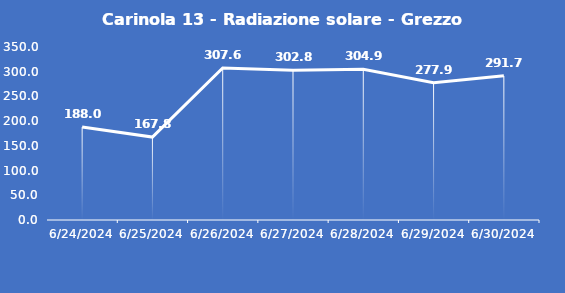
| Category | Carinola 13 - Radiazione solare - Grezzo (W/m2) |
|---|---|
| 6/24/24 | 188 |
| 6/25/24 | 167.8 |
| 6/26/24 | 307.6 |
| 6/27/24 | 302.8 |
| 6/28/24 | 304.9 |
| 6/29/24 | 277.9 |
| 6/30/24 | 291.7 |